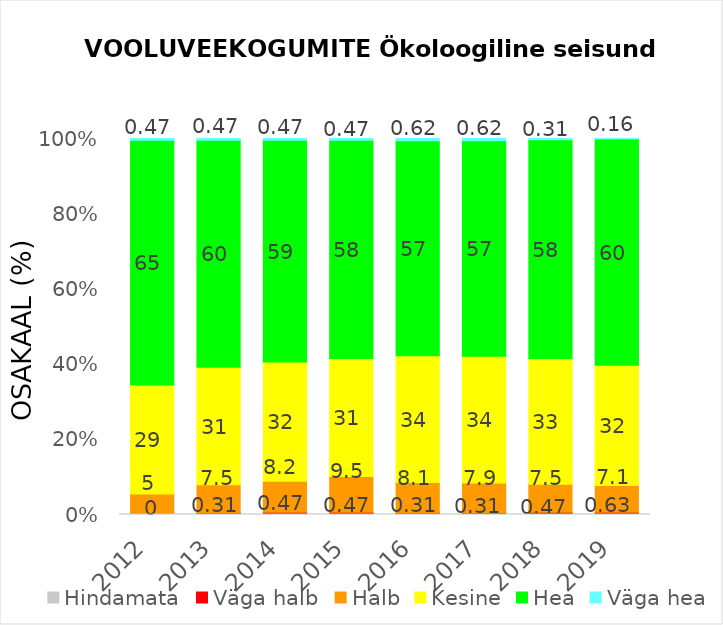
| Category | Hindamata | Väga halb | Halb | Kesine | Hea | Väga hea |
|---|---|---|---|---|---|---|
| 2012.0 | 0.155 | 0 | 5.28 | 29.037 | 65.062 | 0.466 |
| 2013.0 | 0.155 | 0.311 | 7.453 | 31.211 | 60.404 | 0.466 |
| 2014.0 | 0.155 | 0.466 | 8.23 | 31.677 | 59.006 | 0.466 |
| 2015.0 | 0.155 | 0.466 | 9.472 | 31.366 | 58.075 | 0.466 |
| 2016.0 | 0.155 | 0.311 | 8.075 | 33.696 | 57.143 | 0.621 |
| 2017.0 | 0.155 | 0.311 | 7.919 | 33.696 | 57.298 | 0.621 |
| 2018.0 | 0.155 | 0.466 | 7.453 | 33.385 | 58.23 | 0.311 |
| 2019.0 | 0 | 0.63 | 7.087 | 31.969 | 60.157 | 0.157 |